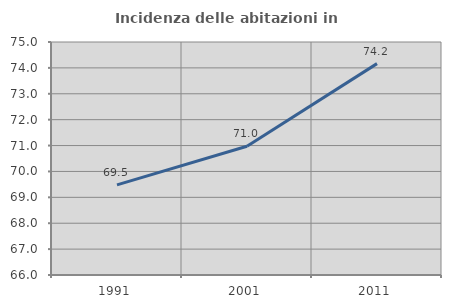
| Category | Incidenza delle abitazioni in proprietà  |
|---|---|
| 1991.0 | 69.483 |
| 2001.0 | 70.973 |
| 2011.0 | 74.165 |